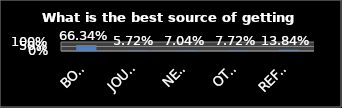
| Category | Series 0 |
|---|---|
| BOOKS | 0.663 |
| JOURNALS/MAGAZINES | 0.057 |
| NEWSPAPERS | 0.07 |
| OTHERS | 0.077 |
| REFFERENCE BOOKS | 0.138 |